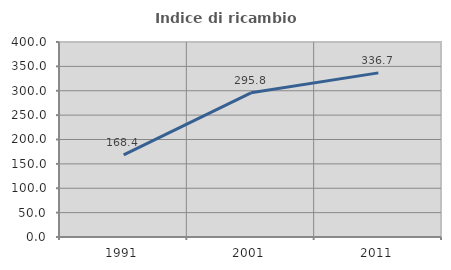
| Category | Indice di ricambio occupazionale  |
|---|---|
| 1991.0 | 168.444 |
| 2001.0 | 295.806 |
| 2011.0 | 336.667 |